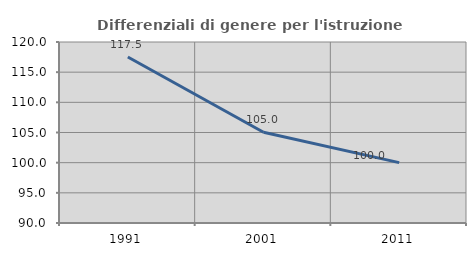
| Category | Differenziali di genere per l'istruzione superiore |
|---|---|
| 1991.0 | 117.505 |
| 2001.0 | 105.045 |
| 2011.0 | 100.011 |